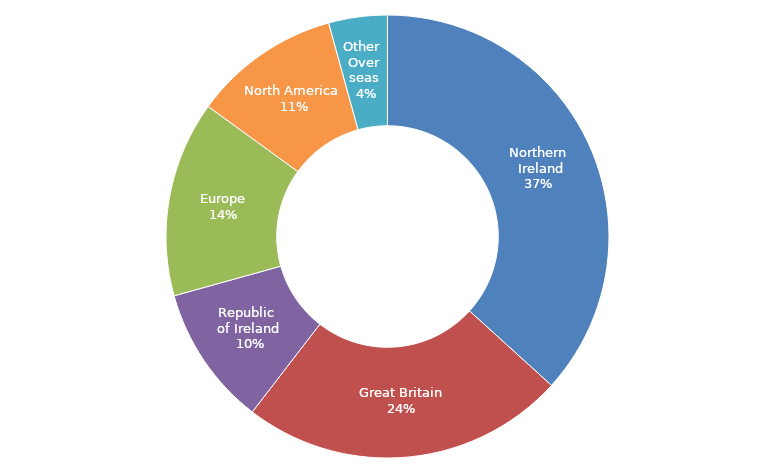
| Category | 2015 |
|---|---|
| Northern Ireland | 0.367 |
| Great Britain | 0.237 |
| Republic of Ireland | 0.102 |
| Europe | 0.143 |
| North America | 0.107 |
| Other Overseas | 0.043 |